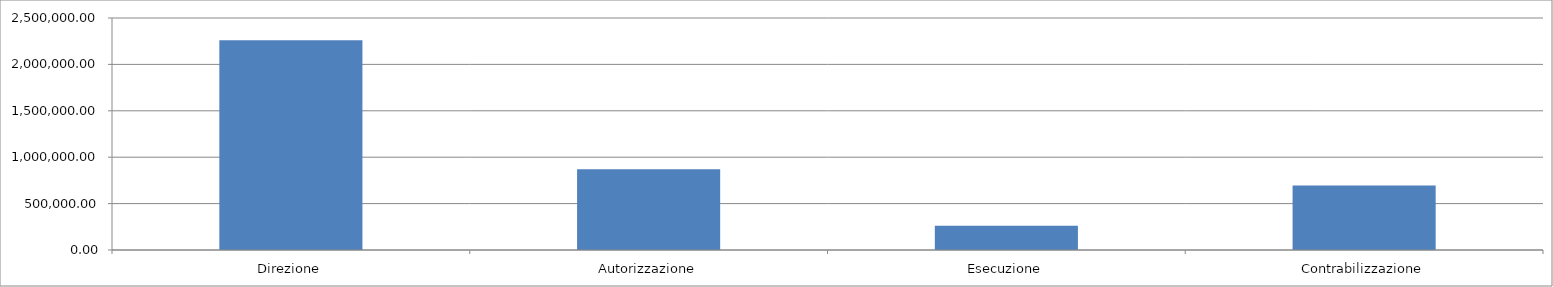
| Category | Series 0 |
|---|---|
| Direzione | 2260939.399 |
| Autorizzazione | 869592.077 |
| Esecuzione | 260877.623 |
| Contrabilizzazione | 695673.661 |